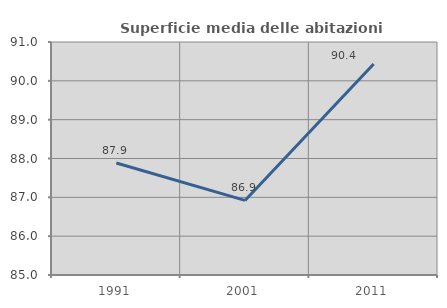
| Category | Superficie media delle abitazioni occupate |
|---|---|
| 1991.0 | 87.885 |
| 2001.0 | 86.921 |
| 2011.0 | 90.435 |